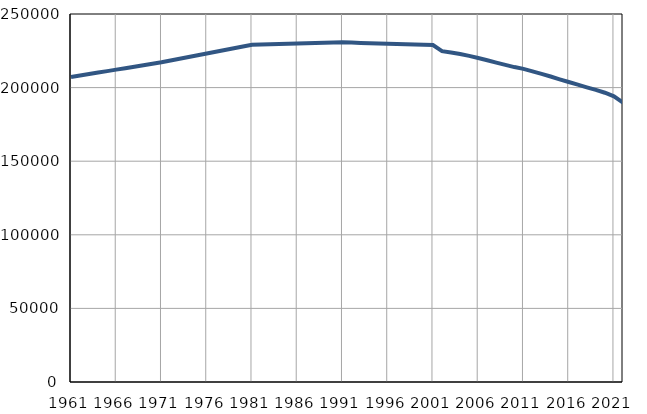
| Category | Број
становника |
|---|---|
| 1961.0 | 207195 |
| 1962.0 | 208198 |
| 1963.0 | 209201 |
| 1964.0 | 210203 |
| 1965.0 | 211206 |
| 1966.0 | 212209 |
| 1967.0 | 213212 |
| 1968.0 | 214215 |
| 1969.0 | 215217 |
| 1970.0 | 216220 |
| 1971.0 | 217223 |
| 1972.0 | 218405 |
| 1973.0 | 219588 |
| 1974.0 | 220770 |
| 1975.0 | 221953 |
| 1976.0 | 223135 |
| 1977.0 | 224317 |
| 1978.0 | 225500 |
| 1979.0 | 226682 |
| 1980.0 | 227865 |
| 1981.0 | 229047 |
| 1982.0 | 229217 |
| 1983.0 | 229387 |
| 1984.0 | 229557 |
| 1985.0 | 229727 |
| 1986.0 | 229898 |
| 1987.0 | 230068 |
| 1988.0 | 230238 |
| 1989.0 | 230408 |
| 1990.0 | 230578 |
| 1991.0 | 230748 |
| 1992.0 | 230561 |
| 1993.0 | 230374 |
| 1994.0 | 230186 |
| 1995.0 | 229999 |
| 1996.0 | 229812 |
| 1997.0 | 229625 |
| 1998.0 | 229438 |
| 1999.0 | 229251 |
| 2000.0 | 229063 |
| 2001.0 | 228876 |
| 2002.0 | 224746 |
| 2003.0 | 223862 |
| 2004.0 | 222845 |
| 2005.0 | 221523 |
| 2006.0 | 220094 |
| 2007.0 | 218612 |
| 2008.0 | 216977 |
| 2009.0 | 215422 |
| 2010.0 | 213939 |
| 2011.0 | 212752 |
| 2012.0 | 211042 |
| 2013.0 | 209365 |
| 2014.0 | 207568 |
| 2015.0 | 205631 |
| 2016.0 | 203799 |
| 2017.0 | 202026 |
| 2018.0 | 200205 |
| 2019.0 | 198490 |
| 2020.0 | 196516 |
| 2021.0 | 194072 |
| 2022.0 | 189892 |